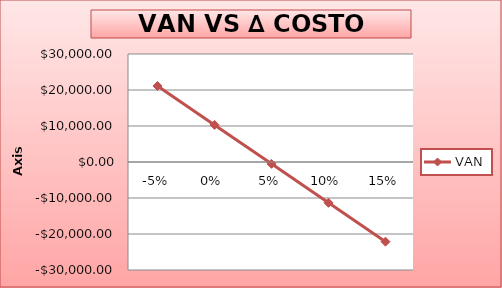
| Category | VAN |
|---|---|
| -0.05 | 21115.657 |
| 0.0 | 10301.021 |
| 0.05 | -513.615 |
| 0.1 | -11328.252 |
| 0.15 | -22142.888 |